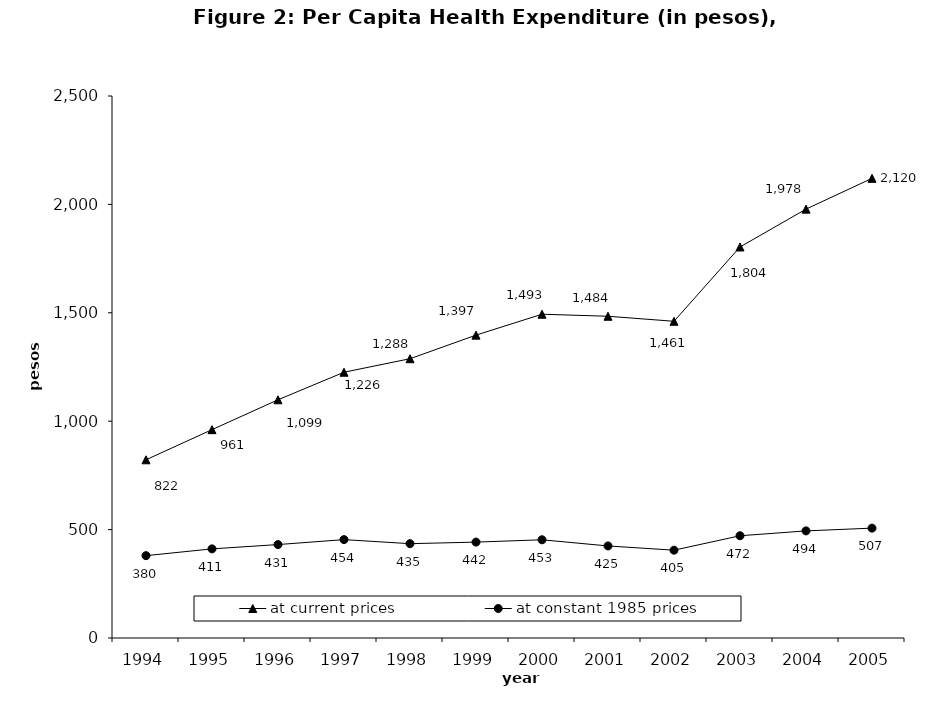
| Category | at current prices | at constant 1985 prices |
|---|---|---|
| 1994.0 | 822.011 | 379.769 |
| 1995.0 | 961.015 | 411.101 |
| 1996.0 | 1098.809 | 430.942 |
| 1997.0 | 1225.873 | 453.809 |
| 1998.0 | 1288.181 | 435.044 |
| 1999.0 | 1396.962 | 442.355 |
| 2000.0 | 1493.394 | 453.019 |
| 2001.0 | 1484.085 | 424.549 |
| 2002.0 | 1460.816 | 405.1 |
| 2003.0 | 1803.706 | 471.621 |
| 2004.0 | 1978.189 | 494 |
| 2005.0 | 2120.218 | 506.744 |